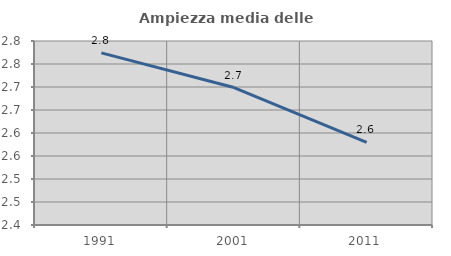
| Category | Ampiezza media delle famiglie |
|---|---|
| 1991.0 | 2.774 |
| 2001.0 | 2.699 |
| 2011.0 | 2.58 |